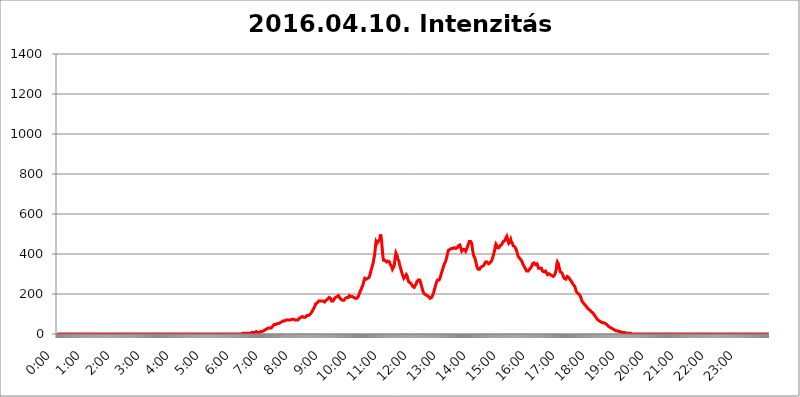
| Category | 2016.04.10. Intenzitás [W/m^2] |
|---|---|
| 0.0 | 0 |
| 0.0006944444444444445 | 0 |
| 0.001388888888888889 | 0 |
| 0.0020833333333333333 | 0 |
| 0.002777777777777778 | 0 |
| 0.003472222222222222 | 0 |
| 0.004166666666666667 | 0 |
| 0.004861111111111111 | 0 |
| 0.005555555555555556 | 0 |
| 0.0062499999999999995 | 0 |
| 0.006944444444444444 | 0 |
| 0.007638888888888889 | 0 |
| 0.008333333333333333 | 0 |
| 0.009027777777777779 | 0 |
| 0.009722222222222222 | 0 |
| 0.010416666666666666 | 0 |
| 0.011111111111111112 | 0 |
| 0.011805555555555555 | 0 |
| 0.012499999999999999 | 0 |
| 0.013194444444444444 | 0 |
| 0.013888888888888888 | 0 |
| 0.014583333333333332 | 0 |
| 0.015277777777777777 | 0 |
| 0.015972222222222224 | 0 |
| 0.016666666666666666 | 0 |
| 0.017361111111111112 | 0 |
| 0.018055555555555557 | 0 |
| 0.01875 | 0 |
| 0.019444444444444445 | 0 |
| 0.02013888888888889 | 0 |
| 0.020833333333333332 | 0 |
| 0.02152777777777778 | 0 |
| 0.022222222222222223 | 0 |
| 0.02291666666666667 | 0 |
| 0.02361111111111111 | 0 |
| 0.024305555555555556 | 0 |
| 0.024999999999999998 | 0 |
| 0.025694444444444447 | 0 |
| 0.02638888888888889 | 0 |
| 0.027083333333333334 | 0 |
| 0.027777777777777776 | 0 |
| 0.02847222222222222 | 0 |
| 0.029166666666666664 | 0 |
| 0.029861111111111113 | 0 |
| 0.030555555555555555 | 0 |
| 0.03125 | 0 |
| 0.03194444444444445 | 0 |
| 0.03263888888888889 | 0 |
| 0.03333333333333333 | 0 |
| 0.034027777777777775 | 0 |
| 0.034722222222222224 | 0 |
| 0.035416666666666666 | 0 |
| 0.036111111111111115 | 0 |
| 0.03680555555555556 | 0 |
| 0.0375 | 0 |
| 0.03819444444444444 | 0 |
| 0.03888888888888889 | 0 |
| 0.03958333333333333 | 0 |
| 0.04027777777777778 | 0 |
| 0.04097222222222222 | 0 |
| 0.041666666666666664 | 0 |
| 0.042361111111111106 | 0 |
| 0.04305555555555556 | 0 |
| 0.043750000000000004 | 0 |
| 0.044444444444444446 | 0 |
| 0.04513888888888889 | 0 |
| 0.04583333333333334 | 0 |
| 0.04652777777777778 | 0 |
| 0.04722222222222222 | 0 |
| 0.04791666666666666 | 0 |
| 0.04861111111111111 | 0 |
| 0.049305555555555554 | 0 |
| 0.049999999999999996 | 0 |
| 0.05069444444444445 | 0 |
| 0.051388888888888894 | 0 |
| 0.052083333333333336 | 0 |
| 0.05277777777777778 | 0 |
| 0.05347222222222222 | 0 |
| 0.05416666666666667 | 0 |
| 0.05486111111111111 | 0 |
| 0.05555555555555555 | 0 |
| 0.05625 | 0 |
| 0.05694444444444444 | 0 |
| 0.057638888888888885 | 0 |
| 0.05833333333333333 | 0 |
| 0.05902777777777778 | 0 |
| 0.059722222222222225 | 0 |
| 0.06041666666666667 | 0 |
| 0.061111111111111116 | 0 |
| 0.06180555555555556 | 0 |
| 0.0625 | 0 |
| 0.06319444444444444 | 0 |
| 0.06388888888888888 | 0 |
| 0.06458333333333334 | 0 |
| 0.06527777777777778 | 0 |
| 0.06597222222222222 | 0 |
| 0.06666666666666667 | 0 |
| 0.06736111111111111 | 0 |
| 0.06805555555555555 | 0 |
| 0.06874999999999999 | 0 |
| 0.06944444444444443 | 0 |
| 0.07013888888888889 | 0 |
| 0.07083333333333333 | 0 |
| 0.07152777777777779 | 0 |
| 0.07222222222222223 | 0 |
| 0.07291666666666667 | 0 |
| 0.07361111111111111 | 0 |
| 0.07430555555555556 | 0 |
| 0.075 | 0 |
| 0.07569444444444444 | 0 |
| 0.0763888888888889 | 0 |
| 0.07708333333333334 | 0 |
| 0.07777777777777778 | 0 |
| 0.07847222222222222 | 0 |
| 0.07916666666666666 | 0 |
| 0.0798611111111111 | 0 |
| 0.08055555555555556 | 0 |
| 0.08125 | 0 |
| 0.08194444444444444 | 0 |
| 0.08263888888888889 | 0 |
| 0.08333333333333333 | 0 |
| 0.08402777777777777 | 0 |
| 0.08472222222222221 | 0 |
| 0.08541666666666665 | 0 |
| 0.08611111111111112 | 0 |
| 0.08680555555555557 | 0 |
| 0.08750000000000001 | 0 |
| 0.08819444444444445 | 0 |
| 0.08888888888888889 | 0 |
| 0.08958333333333333 | 0 |
| 0.09027777777777778 | 0 |
| 0.09097222222222222 | 0 |
| 0.09166666666666667 | 0 |
| 0.09236111111111112 | 0 |
| 0.09305555555555556 | 0 |
| 0.09375 | 0 |
| 0.09444444444444444 | 0 |
| 0.09513888888888888 | 0 |
| 0.09583333333333333 | 0 |
| 0.09652777777777777 | 0 |
| 0.09722222222222222 | 0 |
| 0.09791666666666667 | 0 |
| 0.09861111111111111 | 0 |
| 0.09930555555555555 | 0 |
| 0.09999999999999999 | 0 |
| 0.10069444444444443 | 0 |
| 0.1013888888888889 | 0 |
| 0.10208333333333335 | 0 |
| 0.10277777777777779 | 0 |
| 0.10347222222222223 | 0 |
| 0.10416666666666667 | 0 |
| 0.10486111111111111 | 0 |
| 0.10555555555555556 | 0 |
| 0.10625 | 0 |
| 0.10694444444444444 | 0 |
| 0.1076388888888889 | 0 |
| 0.10833333333333334 | 0 |
| 0.10902777777777778 | 0 |
| 0.10972222222222222 | 0 |
| 0.1111111111111111 | 0 |
| 0.11180555555555556 | 0 |
| 0.11180555555555556 | 0 |
| 0.1125 | 0 |
| 0.11319444444444444 | 0 |
| 0.11388888888888889 | 0 |
| 0.11458333333333333 | 0 |
| 0.11527777777777777 | 0 |
| 0.11597222222222221 | 0 |
| 0.11666666666666665 | 0 |
| 0.1173611111111111 | 0 |
| 0.11805555555555557 | 0 |
| 0.11944444444444445 | 0 |
| 0.12013888888888889 | 0 |
| 0.12083333333333333 | 0 |
| 0.12152777777777778 | 0 |
| 0.12222222222222223 | 0 |
| 0.12291666666666667 | 0 |
| 0.12291666666666667 | 0 |
| 0.12361111111111112 | 0 |
| 0.12430555555555556 | 0 |
| 0.125 | 0 |
| 0.12569444444444444 | 0 |
| 0.12638888888888888 | 0 |
| 0.12708333333333333 | 0 |
| 0.16875 | 0 |
| 0.12847222222222224 | 0 |
| 0.12916666666666668 | 0 |
| 0.12986111111111112 | 0 |
| 0.13055555555555556 | 0 |
| 0.13125 | 0 |
| 0.13194444444444445 | 0 |
| 0.1326388888888889 | 0 |
| 0.13333333333333333 | 0 |
| 0.13402777777777777 | 0 |
| 0.13402777777777777 | 0 |
| 0.13472222222222222 | 0 |
| 0.13541666666666666 | 0 |
| 0.1361111111111111 | 0 |
| 0.13749999999999998 | 0 |
| 0.13819444444444443 | 0 |
| 0.1388888888888889 | 0 |
| 0.13958333333333334 | 0 |
| 0.14027777777777778 | 0 |
| 0.14097222222222222 | 0 |
| 0.14166666666666666 | 0 |
| 0.1423611111111111 | 0 |
| 0.14305555555555557 | 0 |
| 0.14375000000000002 | 0 |
| 0.14444444444444446 | 0 |
| 0.1451388888888889 | 0 |
| 0.1451388888888889 | 0 |
| 0.14652777777777778 | 0 |
| 0.14722222222222223 | 0 |
| 0.14791666666666667 | 0 |
| 0.1486111111111111 | 0 |
| 0.14930555555555555 | 0 |
| 0.15 | 0 |
| 0.15069444444444444 | 0 |
| 0.15138888888888888 | 0 |
| 0.15208333333333332 | 0 |
| 0.15277777777777776 | 0 |
| 0.15347222222222223 | 0 |
| 0.15416666666666667 | 0 |
| 0.15486111111111112 | 0 |
| 0.15555555555555556 | 0 |
| 0.15625 | 0 |
| 0.15694444444444444 | 0 |
| 0.15763888888888888 | 0 |
| 0.15833333333333333 | 0 |
| 0.15902777777777777 | 0 |
| 0.15972222222222224 | 0 |
| 0.16041666666666668 | 0 |
| 0.16111111111111112 | 0 |
| 0.16180555555555556 | 0 |
| 0.1625 | 0 |
| 0.16319444444444445 | 0 |
| 0.1638888888888889 | 0 |
| 0.16458333333333333 | 0 |
| 0.16527777777777777 | 0 |
| 0.16597222222222222 | 0 |
| 0.16666666666666666 | 0 |
| 0.1673611111111111 | 0 |
| 0.16805555555555554 | 0 |
| 0.16874999999999998 | 0 |
| 0.16944444444444443 | 0 |
| 0.17013888888888887 | 0 |
| 0.1708333333333333 | 0 |
| 0.17152777777777775 | 0 |
| 0.17222222222222225 | 0 |
| 0.1729166666666667 | 0 |
| 0.17361111111111113 | 0 |
| 0.17430555555555557 | 0 |
| 0.17500000000000002 | 0 |
| 0.17569444444444446 | 0 |
| 0.1763888888888889 | 0 |
| 0.17708333333333334 | 0 |
| 0.17777777777777778 | 0 |
| 0.17847222222222223 | 0 |
| 0.17916666666666667 | 0 |
| 0.1798611111111111 | 0 |
| 0.18055555555555555 | 0 |
| 0.18125 | 0 |
| 0.18194444444444444 | 0 |
| 0.1826388888888889 | 0 |
| 0.18333333333333335 | 0 |
| 0.1840277777777778 | 0 |
| 0.18472222222222223 | 0 |
| 0.18541666666666667 | 0 |
| 0.18611111111111112 | 0 |
| 0.18680555555555556 | 0 |
| 0.1875 | 0 |
| 0.18819444444444444 | 0 |
| 0.18888888888888888 | 0 |
| 0.18958333333333333 | 0 |
| 0.19027777777777777 | 0 |
| 0.1909722222222222 | 0 |
| 0.19166666666666665 | 0 |
| 0.19236111111111112 | 0 |
| 0.19305555555555554 | 0 |
| 0.19375 | 0 |
| 0.19444444444444445 | 0 |
| 0.1951388888888889 | 0 |
| 0.19583333333333333 | 0 |
| 0.19652777777777777 | 0 |
| 0.19722222222222222 | 0 |
| 0.19791666666666666 | 0 |
| 0.1986111111111111 | 0 |
| 0.19930555555555554 | 0 |
| 0.19999999999999998 | 0 |
| 0.20069444444444443 | 0 |
| 0.20138888888888887 | 0 |
| 0.2020833333333333 | 0 |
| 0.2027777777777778 | 0 |
| 0.2034722222222222 | 0 |
| 0.2041666666666667 | 0 |
| 0.20486111111111113 | 0 |
| 0.20555555555555557 | 0 |
| 0.20625000000000002 | 0 |
| 0.20694444444444446 | 0 |
| 0.2076388888888889 | 0 |
| 0.20833333333333334 | 0 |
| 0.20902777777777778 | 0 |
| 0.20972222222222223 | 0 |
| 0.21041666666666667 | 0 |
| 0.2111111111111111 | 0 |
| 0.21180555555555555 | 0 |
| 0.2125 | 0 |
| 0.21319444444444444 | 0 |
| 0.2138888888888889 | 0 |
| 0.21458333333333335 | 0 |
| 0.2152777777777778 | 0 |
| 0.21597222222222223 | 0 |
| 0.21666666666666667 | 0 |
| 0.21736111111111112 | 0 |
| 0.21805555555555556 | 0 |
| 0.21875 | 0 |
| 0.21944444444444444 | 0 |
| 0.22013888888888888 | 0 |
| 0.22083333333333333 | 0 |
| 0.22152777777777777 | 0 |
| 0.2222222222222222 | 0 |
| 0.22291666666666665 | 0 |
| 0.2236111111111111 | 0 |
| 0.22430555555555556 | 0 |
| 0.225 | 0 |
| 0.22569444444444445 | 0 |
| 0.2263888888888889 | 0 |
| 0.22708333333333333 | 0 |
| 0.22777777777777777 | 0 |
| 0.22847222222222222 | 0 |
| 0.22916666666666666 | 0 |
| 0.2298611111111111 | 0 |
| 0.23055555555555554 | 0 |
| 0.23124999999999998 | 0 |
| 0.23194444444444443 | 0 |
| 0.23263888888888887 | 0 |
| 0.2333333333333333 | 0 |
| 0.2340277777777778 | 0 |
| 0.2347222222222222 | 0 |
| 0.2354166666666667 | 0 |
| 0.23611111111111113 | 0 |
| 0.23680555555555557 | 0 |
| 0.23750000000000002 | 0 |
| 0.23819444444444446 | 0 |
| 0.2388888888888889 | 0 |
| 0.23958333333333334 | 0 |
| 0.24027777777777778 | 0 |
| 0.24097222222222223 | 0 |
| 0.24166666666666667 | 0 |
| 0.2423611111111111 | 0 |
| 0.24305555555555555 | 0 |
| 0.24375 | 0 |
| 0.24444444444444446 | 0 |
| 0.24513888888888888 | 0 |
| 0.24583333333333335 | 0 |
| 0.2465277777777778 | 0 |
| 0.24722222222222223 | 0 |
| 0.24791666666666667 | 0 |
| 0.24861111111111112 | 0 |
| 0.24930555555555556 | 0 |
| 0.25 | 0 |
| 0.25069444444444444 | 0 |
| 0.2513888888888889 | 0 |
| 0.2520833333333333 | 0 |
| 0.25277777777777777 | 0 |
| 0.2534722222222222 | 0 |
| 0.25416666666666665 | 0 |
| 0.2548611111111111 | 0 |
| 0.2555555555555556 | 0 |
| 0.25625000000000003 | 0 |
| 0.2569444444444445 | 0 |
| 0.2576388888888889 | 0 |
| 0.25833333333333336 | 0 |
| 0.2590277777777778 | 0 |
| 0.25972222222222224 | 0 |
| 0.2604166666666667 | 3.525 |
| 0.2611111111111111 | 3.525 |
| 0.26180555555555557 | 3.525 |
| 0.2625 | 3.525 |
| 0.26319444444444445 | 3.525 |
| 0.2638888888888889 | 3.525 |
| 0.26458333333333334 | 3.525 |
| 0.2652777777777778 | 3.525 |
| 0.2659722222222222 | 3.525 |
| 0.26666666666666666 | 3.525 |
| 0.2673611111111111 | 3.525 |
| 0.26805555555555555 | 3.525 |
| 0.26875 | 3.525 |
| 0.26944444444444443 | 3.525 |
| 0.2701388888888889 | 3.525 |
| 0.2708333333333333 | 3.525 |
| 0.27152777777777776 | 3.525 |
| 0.2722222222222222 | 3.525 |
| 0.27291666666666664 | 7.887 |
| 0.2736111111111111 | 7.887 |
| 0.2743055555555555 | 7.887 |
| 0.27499999999999997 | 7.887 |
| 0.27569444444444446 | 7.887 |
| 0.27638888888888885 | 7.887 |
| 0.27708333333333335 | 7.887 |
| 0.2777777777777778 | 7.887 |
| 0.27847222222222223 | 7.887 |
| 0.2791666666666667 | 12.257 |
| 0.2798611111111111 | 12.257 |
| 0.28055555555555556 | 7.887 |
| 0.28125 | 7.887 |
| 0.28194444444444444 | 7.887 |
| 0.2826388888888889 | 7.887 |
| 0.2833333333333333 | 7.887 |
| 0.28402777777777777 | 7.887 |
| 0.2847222222222222 | 7.887 |
| 0.28541666666666665 | 12.257 |
| 0.28611111111111115 | 12.257 |
| 0.28680555555555554 | 12.257 |
| 0.28750000000000003 | 12.257 |
| 0.2881944444444445 | 12.257 |
| 0.2888888888888889 | 16.636 |
| 0.28958333333333336 | 16.636 |
| 0.2902777777777778 | 16.636 |
| 0.29097222222222224 | 16.636 |
| 0.2916666666666667 | 21.024 |
| 0.2923611111111111 | 21.024 |
| 0.29305555555555557 | 21.024 |
| 0.29375 | 25.419 |
| 0.29444444444444445 | 25.419 |
| 0.2951388888888889 | 25.419 |
| 0.29583333333333334 | 29.823 |
| 0.2965277777777778 | 29.823 |
| 0.2972222222222222 | 29.823 |
| 0.29791666666666666 | 29.823 |
| 0.2986111111111111 | 29.823 |
| 0.29930555555555555 | 29.823 |
| 0.3 | 29.823 |
| 0.30069444444444443 | 34.234 |
| 0.3013888888888889 | 34.234 |
| 0.3020833333333333 | 38.653 |
| 0.30277777777777776 | 43.079 |
| 0.3034722222222222 | 43.079 |
| 0.30416666666666664 | 47.511 |
| 0.3048611111111111 | 47.511 |
| 0.3055555555555555 | 47.511 |
| 0.30624999999999997 | 47.511 |
| 0.3069444444444444 | 51.951 |
| 0.3076388888888889 | 51.951 |
| 0.30833333333333335 | 51.951 |
| 0.3090277777777778 | 51.951 |
| 0.30972222222222223 | 51.951 |
| 0.3104166666666667 | 51.951 |
| 0.3111111111111111 | 51.951 |
| 0.31180555555555556 | 51.951 |
| 0.3125 | 56.398 |
| 0.31319444444444444 | 56.398 |
| 0.3138888888888889 | 60.85 |
| 0.3145833333333333 | 60.85 |
| 0.31527777777777777 | 65.31 |
| 0.3159722222222222 | 65.31 |
| 0.31666666666666665 | 65.31 |
| 0.31736111111111115 | 65.31 |
| 0.31805555555555554 | 65.31 |
| 0.31875000000000003 | 65.31 |
| 0.3194444444444445 | 65.31 |
| 0.3201388888888889 | 65.31 |
| 0.32083333333333336 | 69.775 |
| 0.3215277777777778 | 69.775 |
| 0.32222222222222224 | 69.775 |
| 0.3229166666666667 | 69.775 |
| 0.3236111111111111 | 69.775 |
| 0.32430555555555557 | 69.775 |
| 0.325 | 69.775 |
| 0.32569444444444445 | 69.775 |
| 0.3263888888888889 | 69.775 |
| 0.32708333333333334 | 69.775 |
| 0.3277777777777778 | 69.775 |
| 0.3284722222222222 | 74.246 |
| 0.32916666666666666 | 74.246 |
| 0.3298611111111111 | 74.246 |
| 0.33055555555555555 | 74.246 |
| 0.33125 | 74.246 |
| 0.33194444444444443 | 74.246 |
| 0.3326388888888889 | 74.246 |
| 0.3333333333333333 | 69.775 |
| 0.3340277777777778 | 69.775 |
| 0.3347222222222222 | 69.775 |
| 0.3354166666666667 | 69.775 |
| 0.3361111111111111 | 69.775 |
| 0.3368055555555556 | 69.775 |
| 0.33749999999999997 | 69.775 |
| 0.33819444444444446 | 74.246 |
| 0.33888888888888885 | 74.246 |
| 0.33958333333333335 | 78.722 |
| 0.34027777777777773 | 78.722 |
| 0.34097222222222223 | 83.205 |
| 0.3416666666666666 | 83.205 |
| 0.3423611111111111 | 83.205 |
| 0.3430555555555555 | 83.205 |
| 0.34375 | 87.692 |
| 0.3444444444444445 | 87.692 |
| 0.3451388888888889 | 83.205 |
| 0.3458333333333334 | 83.205 |
| 0.34652777777777777 | 83.205 |
| 0.34722222222222227 | 83.205 |
| 0.34791666666666665 | 83.205 |
| 0.34861111111111115 | 83.205 |
| 0.34930555555555554 | 87.692 |
| 0.35000000000000003 | 92.184 |
| 0.3506944444444444 | 92.184 |
| 0.3513888888888889 | 96.682 |
| 0.3520833333333333 | 92.184 |
| 0.3527777777777778 | 92.184 |
| 0.3534722222222222 | 92.184 |
| 0.3541666666666667 | 96.682 |
| 0.3548611111111111 | 101.184 |
| 0.35555555555555557 | 101.184 |
| 0.35625 | 105.69 |
| 0.35694444444444445 | 110.201 |
| 0.3576388888888889 | 110.201 |
| 0.35833333333333334 | 119.235 |
| 0.3590277777777778 | 123.758 |
| 0.3597222222222222 | 128.284 |
| 0.36041666666666666 | 132.814 |
| 0.3611111111111111 | 137.347 |
| 0.36180555555555555 | 141.884 |
| 0.3625 | 150.964 |
| 0.36319444444444443 | 155.509 |
| 0.3638888888888889 | 155.509 |
| 0.3645833333333333 | 155.509 |
| 0.3652777777777778 | 160.056 |
| 0.3659722222222222 | 160.056 |
| 0.3666666666666667 | 164.605 |
| 0.3673611111111111 | 164.605 |
| 0.3680555555555556 | 164.605 |
| 0.36874999999999997 | 164.605 |
| 0.36944444444444446 | 164.605 |
| 0.37013888888888885 | 164.605 |
| 0.37083333333333335 | 164.605 |
| 0.37152777777777773 | 164.605 |
| 0.37222222222222223 | 164.605 |
| 0.3729166666666666 | 164.605 |
| 0.3736111111111111 | 164.605 |
| 0.3743055555555555 | 164.605 |
| 0.375 | 160.056 |
| 0.3756944444444445 | 164.605 |
| 0.3763888888888889 | 164.605 |
| 0.3770833333333334 | 169.156 |
| 0.37777777777777777 | 169.156 |
| 0.37847222222222227 | 173.709 |
| 0.37916666666666665 | 173.709 |
| 0.37986111111111115 | 173.709 |
| 0.38055555555555554 | 178.264 |
| 0.38125000000000003 | 182.82 |
| 0.3819444444444444 | 182.82 |
| 0.3826388888888889 | 182.82 |
| 0.3833333333333333 | 178.264 |
| 0.3840277777777778 | 173.709 |
| 0.3847222222222222 | 164.605 |
| 0.3854166666666667 | 164.605 |
| 0.3861111111111111 | 164.605 |
| 0.38680555555555557 | 164.605 |
| 0.3875 | 169.156 |
| 0.38819444444444445 | 173.709 |
| 0.3888888888888889 | 173.709 |
| 0.38958333333333334 | 178.264 |
| 0.3902777777777778 | 182.82 |
| 0.3909722222222222 | 182.82 |
| 0.39166666666666666 | 187.378 |
| 0.3923611111111111 | 187.378 |
| 0.39305555555555555 | 191.937 |
| 0.39375 | 191.937 |
| 0.39444444444444443 | 191.937 |
| 0.3951388888888889 | 187.378 |
| 0.3958333333333333 | 182.82 |
| 0.3965277777777778 | 182.82 |
| 0.3972222222222222 | 178.264 |
| 0.3979166666666667 | 173.709 |
| 0.3986111111111111 | 173.709 |
| 0.3993055555555556 | 169.156 |
| 0.39999999999999997 | 169.156 |
| 0.40069444444444446 | 169.156 |
| 0.40138888888888885 | 169.156 |
| 0.40208333333333335 | 169.156 |
| 0.40277777777777773 | 169.156 |
| 0.40347222222222223 | 173.709 |
| 0.4041666666666666 | 178.264 |
| 0.4048611111111111 | 182.82 |
| 0.4055555555555555 | 182.82 |
| 0.40625 | 182.82 |
| 0.4069444444444445 | 182.82 |
| 0.4076388888888889 | 182.82 |
| 0.4083333333333334 | 182.82 |
| 0.40902777777777777 | 182.82 |
| 0.40972222222222227 | 191.937 |
| 0.41041666666666665 | 196.497 |
| 0.41111111111111115 | 191.937 |
| 0.41180555555555554 | 187.378 |
| 0.41250000000000003 | 187.378 |
| 0.4131944444444444 | 187.378 |
| 0.4138888888888889 | 187.378 |
| 0.4145833333333333 | 187.378 |
| 0.4152777777777778 | 182.82 |
| 0.4159722222222222 | 182.82 |
| 0.4166666666666667 | 182.82 |
| 0.4173611111111111 | 178.264 |
| 0.41805555555555557 | 178.264 |
| 0.41875 | 178.264 |
| 0.41944444444444445 | 178.264 |
| 0.4201388888888889 | 178.264 |
| 0.42083333333333334 | 178.264 |
| 0.4215277777777778 | 182.82 |
| 0.4222222222222222 | 187.378 |
| 0.42291666666666666 | 191.937 |
| 0.4236111111111111 | 201.058 |
| 0.42430555555555555 | 205.62 |
| 0.425 | 214.746 |
| 0.42569444444444443 | 219.309 |
| 0.4263888888888889 | 223.873 |
| 0.4270833333333333 | 233 |
| 0.4277777777777778 | 237.564 |
| 0.4284722222222222 | 242.127 |
| 0.4291666666666667 | 251.251 |
| 0.4298611111111111 | 260.373 |
| 0.4305555555555556 | 269.49 |
| 0.43124999999999997 | 278.603 |
| 0.43194444444444446 | 278.603 |
| 0.43263888888888885 | 274.047 |
| 0.43333333333333335 | 274.047 |
| 0.43402777777777773 | 278.603 |
| 0.43472222222222223 | 278.603 |
| 0.4354166666666666 | 278.603 |
| 0.4361111111111111 | 278.603 |
| 0.4368055555555555 | 278.603 |
| 0.4375 | 283.156 |
| 0.4381944444444445 | 292.259 |
| 0.4388888888888889 | 301.354 |
| 0.4395833333333334 | 310.44 |
| 0.44027777777777777 | 319.517 |
| 0.44097222222222227 | 328.584 |
| 0.44166666666666665 | 337.639 |
| 0.44236111111111115 | 346.682 |
| 0.44305555555555554 | 355.712 |
| 0.44375000000000003 | 369.23 |
| 0.4444444444444444 | 382.715 |
| 0.4451388888888889 | 396.164 |
| 0.4458333333333333 | 418.492 |
| 0.4465277777777778 | 445.129 |
| 0.4472222222222222 | 462.786 |
| 0.4479166666666667 | 458.38 |
| 0.4486111111111111 | 453.968 |
| 0.44930555555555557 | 458.38 |
| 0.45 | 462.786 |
| 0.45069444444444445 | 458.38 |
| 0.4513888888888889 | 458.38 |
| 0.45208333333333334 | 471.582 |
| 0.4527777777777778 | 484.735 |
| 0.4534722222222222 | 497.836 |
| 0.45416666666666666 | 484.735 |
| 0.4548611111111111 | 467.187 |
| 0.45555555555555555 | 436.27 |
| 0.45625 | 405.108 |
| 0.45694444444444443 | 382.715 |
| 0.4576388888888889 | 369.23 |
| 0.4583333333333333 | 364.728 |
| 0.4590277777777778 | 369.23 |
| 0.4597222222222222 | 369.23 |
| 0.4604166666666667 | 364.728 |
| 0.4611111111111111 | 364.728 |
| 0.4618055555555556 | 360.221 |
| 0.46249999999999997 | 360.221 |
| 0.46319444444444446 | 360.221 |
| 0.46388888888888885 | 364.728 |
| 0.46458333333333335 | 369.23 |
| 0.46527777777777773 | 369.23 |
| 0.46597222222222223 | 360.221 |
| 0.4666666666666666 | 351.198 |
| 0.4673611111111111 | 346.682 |
| 0.4680555555555555 | 342.162 |
| 0.46875 | 342.162 |
| 0.4694444444444445 | 333.113 |
| 0.4701388888888889 | 324.052 |
| 0.4708333333333334 | 324.052 |
| 0.47152777777777777 | 324.052 |
| 0.47222222222222227 | 337.639 |
| 0.47291666666666665 | 351.198 |
| 0.47361111111111115 | 373.729 |
| 0.47430555555555554 | 391.685 |
| 0.47500000000000003 | 405.108 |
| 0.4756944444444444 | 405.108 |
| 0.4763888888888889 | 405.108 |
| 0.4770833333333333 | 387.202 |
| 0.4777777777777778 | 373.729 |
| 0.4784722222222222 | 369.23 |
| 0.4791666666666667 | 364.728 |
| 0.4798611111111111 | 351.198 |
| 0.48055555555555557 | 342.162 |
| 0.48125 | 337.639 |
| 0.48194444444444445 | 324.052 |
| 0.4826388888888889 | 314.98 |
| 0.48333333333333334 | 305.898 |
| 0.4840277777777778 | 301.354 |
| 0.4847222222222222 | 292.259 |
| 0.48541666666666666 | 287.709 |
| 0.4861111111111111 | 278.603 |
| 0.48680555555555555 | 278.603 |
| 0.4875 | 283.156 |
| 0.48819444444444443 | 287.709 |
| 0.4888888888888889 | 287.709 |
| 0.4895833333333333 | 296.808 |
| 0.4902777777777778 | 296.808 |
| 0.4909722222222222 | 287.709 |
| 0.4916666666666667 | 274.047 |
| 0.4923611111111111 | 269.49 |
| 0.4930555555555556 | 260.373 |
| 0.49374999999999997 | 260.373 |
| 0.49444444444444446 | 255.813 |
| 0.49513888888888885 | 255.813 |
| 0.49583333333333335 | 251.251 |
| 0.49652777777777773 | 251.251 |
| 0.49722222222222223 | 246.689 |
| 0.4979166666666666 | 242.127 |
| 0.4986111111111111 | 237.564 |
| 0.4993055555555555 | 233 |
| 0.5 | 233 |
| 0.5006944444444444 | 233 |
| 0.5013888888888889 | 233 |
| 0.5020833333333333 | 242.127 |
| 0.5027777777777778 | 246.689 |
| 0.5034722222222222 | 251.251 |
| 0.5041666666666667 | 260.373 |
| 0.5048611111111111 | 260.373 |
| 0.5055555555555555 | 264.932 |
| 0.50625 | 269.49 |
| 0.5069444444444444 | 269.49 |
| 0.5076388888888889 | 269.49 |
| 0.5083333333333333 | 269.49 |
| 0.5090277777777777 | 264.932 |
| 0.5097222222222222 | 255.813 |
| 0.5104166666666666 | 246.689 |
| 0.5111111111111112 | 237.564 |
| 0.5118055555555555 | 228.436 |
| 0.5125000000000001 | 219.309 |
| 0.5131944444444444 | 210.182 |
| 0.513888888888889 | 205.62 |
| 0.5145833333333333 | 201.058 |
| 0.5152777777777778 | 201.058 |
| 0.5159722222222222 | 196.497 |
| 0.5166666666666667 | 196.497 |
| 0.517361111111111 | 196.497 |
| 0.5180555555555556 | 196.497 |
| 0.5187499999999999 | 191.937 |
| 0.5194444444444445 | 191.937 |
| 0.5201388888888888 | 187.378 |
| 0.5208333333333334 | 187.378 |
| 0.5215277777777778 | 182.82 |
| 0.5222222222222223 | 182.82 |
| 0.5229166666666667 | 178.264 |
| 0.5236111111111111 | 178.264 |
| 0.5243055555555556 | 182.82 |
| 0.525 | 182.82 |
| 0.5256944444444445 | 187.378 |
| 0.5263888888888889 | 191.937 |
| 0.5270833333333333 | 196.497 |
| 0.5277777777777778 | 205.62 |
| 0.5284722222222222 | 214.746 |
| 0.5291666666666667 | 223.873 |
| 0.5298611111111111 | 233 |
| 0.5305555555555556 | 242.127 |
| 0.53125 | 251.251 |
| 0.5319444444444444 | 260.373 |
| 0.5326388888888889 | 264.932 |
| 0.5333333333333333 | 269.49 |
| 0.5340277777777778 | 269.49 |
| 0.5347222222222222 | 269.49 |
| 0.5354166666666667 | 269.49 |
| 0.5361111111111111 | 274.047 |
| 0.5368055555555555 | 278.603 |
| 0.5375 | 287.709 |
| 0.5381944444444444 | 296.808 |
| 0.5388888888888889 | 305.898 |
| 0.5395833333333333 | 310.44 |
| 0.5402777777777777 | 319.517 |
| 0.5409722222222222 | 328.584 |
| 0.5416666666666666 | 337.639 |
| 0.5423611111111112 | 342.162 |
| 0.5430555555555555 | 351.198 |
| 0.5437500000000001 | 355.712 |
| 0.5444444444444444 | 360.221 |
| 0.545138888888889 | 369.23 |
| 0.5458333333333333 | 378.224 |
| 0.5465277777777778 | 387.202 |
| 0.5472222222222222 | 400.638 |
| 0.5479166666666667 | 409.574 |
| 0.548611111111111 | 418.492 |
| 0.5493055555555556 | 422.943 |
| 0.5499999999999999 | 422.943 |
| 0.5506944444444445 | 422.943 |
| 0.5513888888888888 | 427.39 |
| 0.5520833333333334 | 427.39 |
| 0.5527777777777778 | 427.39 |
| 0.5534722222222223 | 427.39 |
| 0.5541666666666667 | 427.39 |
| 0.5548611111111111 | 427.39 |
| 0.5555555555555556 | 427.39 |
| 0.55625 | 431.833 |
| 0.5569444444444445 | 431.833 |
| 0.5576388888888889 | 431.833 |
| 0.5583333333333333 | 431.833 |
| 0.5590277777777778 | 427.39 |
| 0.5597222222222222 | 431.833 |
| 0.5604166666666667 | 431.833 |
| 0.5611111111111111 | 431.833 |
| 0.5618055555555556 | 436.27 |
| 0.5625 | 440.702 |
| 0.5631944444444444 | 440.702 |
| 0.5638888888888889 | 445.129 |
| 0.5645833333333333 | 445.129 |
| 0.5652777777777778 | 440.702 |
| 0.5659722222222222 | 431.833 |
| 0.5666666666666667 | 422.943 |
| 0.5673611111111111 | 414.035 |
| 0.5680555555555555 | 414.035 |
| 0.56875 | 418.492 |
| 0.5694444444444444 | 422.943 |
| 0.5701388888888889 | 422.943 |
| 0.5708333333333333 | 427.39 |
| 0.5715277777777777 | 422.943 |
| 0.5722222222222222 | 418.492 |
| 0.5729166666666666 | 414.035 |
| 0.5736111111111112 | 414.035 |
| 0.5743055555555555 | 418.492 |
| 0.5750000000000001 | 431.833 |
| 0.5756944444444444 | 440.702 |
| 0.576388888888889 | 445.129 |
| 0.5770833333333333 | 453.968 |
| 0.5777777777777778 | 462.786 |
| 0.5784722222222222 | 467.187 |
| 0.5791666666666667 | 462.786 |
| 0.579861111111111 | 462.786 |
| 0.5805555555555556 | 462.786 |
| 0.5812499999999999 | 453.968 |
| 0.5819444444444445 | 436.27 |
| 0.5826388888888888 | 418.492 |
| 0.5833333333333334 | 405.108 |
| 0.5840277777777778 | 391.685 |
| 0.5847222222222223 | 387.202 |
| 0.5854166666666667 | 382.715 |
| 0.5861111111111111 | 378.224 |
| 0.5868055555555556 | 364.728 |
| 0.5875 | 355.712 |
| 0.5881944444444445 | 342.162 |
| 0.5888888888888889 | 333.113 |
| 0.5895833333333333 | 328.584 |
| 0.5902777777777778 | 324.052 |
| 0.5909722222222222 | 324.052 |
| 0.5916666666666667 | 324.052 |
| 0.5923611111111111 | 324.052 |
| 0.5930555555555556 | 324.052 |
| 0.59375 | 333.113 |
| 0.5944444444444444 | 333.113 |
| 0.5951388888888889 | 333.113 |
| 0.5958333333333333 | 337.639 |
| 0.5965277777777778 | 337.639 |
| 0.5972222222222222 | 342.162 |
| 0.5979166666666667 | 342.162 |
| 0.5986111111111111 | 346.682 |
| 0.5993055555555555 | 351.198 |
| 0.6 | 355.712 |
| 0.6006944444444444 | 360.221 |
| 0.6013888888888889 | 355.712 |
| 0.6020833333333333 | 360.221 |
| 0.6027777777777777 | 360.221 |
| 0.6034722222222222 | 360.221 |
| 0.6041666666666666 | 355.712 |
| 0.6048611111111112 | 351.198 |
| 0.6055555555555555 | 351.198 |
| 0.6062500000000001 | 351.198 |
| 0.6069444444444444 | 355.712 |
| 0.607638888888889 | 355.712 |
| 0.6083333333333333 | 355.712 |
| 0.6090277777777778 | 364.728 |
| 0.6097222222222222 | 369.23 |
| 0.6104166666666667 | 378.224 |
| 0.611111111111111 | 387.202 |
| 0.6118055555555556 | 396.164 |
| 0.6124999999999999 | 405.108 |
| 0.6131944444444445 | 414.035 |
| 0.6138888888888888 | 427.39 |
| 0.6145833333333334 | 440.702 |
| 0.6152777777777778 | 449.551 |
| 0.6159722222222223 | 445.129 |
| 0.6166666666666667 | 440.702 |
| 0.6173611111111111 | 431.833 |
| 0.6180555555555556 | 431.833 |
| 0.61875 | 431.833 |
| 0.6194444444444445 | 431.833 |
| 0.6201388888888889 | 436.27 |
| 0.6208333333333333 | 440.702 |
| 0.6215277777777778 | 440.702 |
| 0.6222222222222222 | 445.129 |
| 0.6229166666666667 | 445.129 |
| 0.6236111111111111 | 449.551 |
| 0.6243055555555556 | 453.968 |
| 0.625 | 458.38 |
| 0.6256944444444444 | 462.786 |
| 0.6263888888888889 | 462.786 |
| 0.6270833333333333 | 462.786 |
| 0.6277777777777778 | 467.187 |
| 0.6284722222222222 | 471.582 |
| 0.6291666666666667 | 480.356 |
| 0.6298611111111111 | 484.735 |
| 0.6305555555555555 | 489.108 |
| 0.63125 | 480.356 |
| 0.6319444444444444 | 471.582 |
| 0.6326388888888889 | 462.786 |
| 0.6333333333333333 | 453.968 |
| 0.6340277777777777 | 453.968 |
| 0.6347222222222222 | 458.38 |
| 0.6354166666666666 | 462.786 |
| 0.6361111111111112 | 471.582 |
| 0.6368055555555555 | 462.786 |
| 0.6375000000000001 | 458.38 |
| 0.6381944444444444 | 453.968 |
| 0.638888888888889 | 449.551 |
| 0.6395833333333333 | 440.702 |
| 0.6402777777777778 | 436.27 |
| 0.6409722222222222 | 436.27 |
| 0.6416666666666667 | 436.27 |
| 0.642361111111111 | 431.833 |
| 0.6430555555555556 | 431.833 |
| 0.6437499999999999 | 422.943 |
| 0.6444444444444445 | 414.035 |
| 0.6451388888888888 | 405.108 |
| 0.6458333333333334 | 396.164 |
| 0.6465277777777778 | 387.202 |
| 0.6472222222222223 | 382.715 |
| 0.6479166666666667 | 382.715 |
| 0.6486111111111111 | 378.224 |
| 0.6493055555555556 | 378.224 |
| 0.65 | 378.224 |
| 0.6506944444444445 | 369.23 |
| 0.6513888888888889 | 364.728 |
| 0.6520833333333333 | 360.221 |
| 0.6527777777777778 | 351.198 |
| 0.6534722222222222 | 346.682 |
| 0.6541666666666667 | 342.162 |
| 0.6548611111111111 | 337.639 |
| 0.6555555555555556 | 333.113 |
| 0.65625 | 328.584 |
| 0.6569444444444444 | 324.052 |
| 0.6576388888888889 | 319.517 |
| 0.6583333333333333 | 314.98 |
| 0.6590277777777778 | 314.98 |
| 0.6597222222222222 | 314.98 |
| 0.6604166666666667 | 314.98 |
| 0.6611111111111111 | 319.517 |
| 0.6618055555555555 | 319.517 |
| 0.6625 | 324.052 |
| 0.6631944444444444 | 324.052 |
| 0.6638888888888889 | 328.584 |
| 0.6645833333333333 | 333.113 |
| 0.6652777777777777 | 337.639 |
| 0.6659722222222222 | 342.162 |
| 0.6666666666666666 | 351.198 |
| 0.6673611111111111 | 355.712 |
| 0.6680555555555556 | 355.712 |
| 0.6687500000000001 | 355.712 |
| 0.6694444444444444 | 351.198 |
| 0.6701388888888888 | 351.198 |
| 0.6708333333333334 | 346.682 |
| 0.6715277777777778 | 351.198 |
| 0.6722222222222222 | 351.198 |
| 0.6729166666666666 | 351.198 |
| 0.6736111111111112 | 346.682 |
| 0.6743055555555556 | 337.639 |
| 0.6749999999999999 | 328.584 |
| 0.6756944444444444 | 324.052 |
| 0.6763888888888889 | 324.052 |
| 0.6770833333333334 | 328.584 |
| 0.6777777777777777 | 333.113 |
| 0.6784722222222223 | 333.113 |
| 0.6791666666666667 | 328.584 |
| 0.6798611111111111 | 324.052 |
| 0.6805555555555555 | 314.98 |
| 0.68125 | 314.98 |
| 0.6819444444444445 | 310.44 |
| 0.6826388888888889 | 310.44 |
| 0.6833333333333332 | 314.98 |
| 0.6840277777777778 | 314.98 |
| 0.6847222222222222 | 314.98 |
| 0.6854166666666667 | 310.44 |
| 0.686111111111111 | 305.898 |
| 0.6868055555555556 | 301.354 |
| 0.6875 | 296.808 |
| 0.6881944444444444 | 296.808 |
| 0.688888888888889 | 296.808 |
| 0.6895833333333333 | 301.354 |
| 0.6902777777777778 | 301.354 |
| 0.6909722222222222 | 301.354 |
| 0.6916666666666668 | 296.808 |
| 0.6923611111111111 | 296.808 |
| 0.6930555555555555 | 292.259 |
| 0.69375 | 292.259 |
| 0.6944444444444445 | 287.709 |
| 0.6951388888888889 | 287.709 |
| 0.6958333333333333 | 287.709 |
| 0.6965277777777777 | 287.709 |
| 0.6972222222222223 | 292.259 |
| 0.6979166666666666 | 296.808 |
| 0.6986111111111111 | 305.898 |
| 0.6993055555555556 | 314.98 |
| 0.7000000000000001 | 324.052 |
| 0.7006944444444444 | 351.198 |
| 0.7013888888888888 | 360.221 |
| 0.7020833333333334 | 360.221 |
| 0.7027777777777778 | 351.198 |
| 0.7034722222222222 | 346.682 |
| 0.7041666666666666 | 346.682 |
| 0.7048611111111112 | 319.517 |
| 0.7055555555555556 | 310.44 |
| 0.7062499999999999 | 305.898 |
| 0.7069444444444444 | 305.898 |
| 0.7076388888888889 | 305.898 |
| 0.7083333333333334 | 301.354 |
| 0.7090277777777777 | 296.808 |
| 0.7097222222222223 | 287.709 |
| 0.7104166666666667 | 283.156 |
| 0.7111111111111111 | 278.603 |
| 0.7118055555555555 | 274.047 |
| 0.7125 | 274.047 |
| 0.7131944444444445 | 274.047 |
| 0.7138888888888889 | 274.047 |
| 0.7145833333333332 | 278.603 |
| 0.7152777777777778 | 287.709 |
| 0.7159722222222222 | 287.709 |
| 0.7166666666666667 | 283.156 |
| 0.717361111111111 | 283.156 |
| 0.7180555555555556 | 278.603 |
| 0.71875 | 274.047 |
| 0.7194444444444444 | 269.49 |
| 0.720138888888889 | 269.49 |
| 0.7208333333333333 | 264.932 |
| 0.7215277777777778 | 260.373 |
| 0.7222222222222222 | 260.373 |
| 0.7229166666666668 | 251.251 |
| 0.7236111111111111 | 251.251 |
| 0.7243055555555555 | 246.689 |
| 0.725 | 242.127 |
| 0.7256944444444445 | 237.564 |
| 0.7263888888888889 | 233 |
| 0.7270833333333333 | 223.873 |
| 0.7277777777777777 | 214.746 |
| 0.7284722222222223 | 210.182 |
| 0.7291666666666666 | 205.62 |
| 0.7298611111111111 | 201.058 |
| 0.7305555555555556 | 201.058 |
| 0.7312500000000001 | 201.058 |
| 0.7319444444444444 | 201.058 |
| 0.7326388888888888 | 196.497 |
| 0.7333333333333334 | 191.937 |
| 0.7340277777777778 | 187.378 |
| 0.7347222222222222 | 178.264 |
| 0.7354166666666666 | 169.156 |
| 0.7361111111111112 | 164.605 |
| 0.7368055555555556 | 160.056 |
| 0.7374999999999999 | 155.509 |
| 0.7381944444444444 | 155.509 |
| 0.7388888888888889 | 150.964 |
| 0.7395833333333334 | 150.964 |
| 0.7402777777777777 | 146.423 |
| 0.7409722222222223 | 141.884 |
| 0.7416666666666667 | 137.347 |
| 0.7423611111111111 | 137.347 |
| 0.7430555555555555 | 132.814 |
| 0.74375 | 128.284 |
| 0.7444444444444445 | 128.284 |
| 0.7451388888888889 | 123.758 |
| 0.7458333333333332 | 119.235 |
| 0.7465277777777778 | 119.235 |
| 0.7472222222222222 | 119.235 |
| 0.7479166666666667 | 114.716 |
| 0.748611111111111 | 114.716 |
| 0.7493055555555556 | 110.201 |
| 0.75 | 110.201 |
| 0.7506944444444444 | 105.69 |
| 0.751388888888889 | 105.69 |
| 0.7520833333333333 | 101.184 |
| 0.7527777777777778 | 96.682 |
| 0.7534722222222222 | 96.682 |
| 0.7541666666666668 | 92.184 |
| 0.7548611111111111 | 87.692 |
| 0.7555555555555555 | 83.205 |
| 0.75625 | 78.722 |
| 0.7569444444444445 | 74.246 |
| 0.7576388888888889 | 74.246 |
| 0.7583333333333333 | 69.775 |
| 0.7590277777777777 | 69.775 |
| 0.7597222222222223 | 65.31 |
| 0.7604166666666666 | 65.31 |
| 0.7611111111111111 | 65.31 |
| 0.7618055555555556 | 60.85 |
| 0.7625000000000001 | 60.85 |
| 0.7631944444444444 | 56.398 |
| 0.7638888888888888 | 56.398 |
| 0.7645833333333334 | 56.398 |
| 0.7652777777777778 | 56.398 |
| 0.7659722222222222 | 56.398 |
| 0.7666666666666666 | 56.398 |
| 0.7673611111111112 | 51.951 |
| 0.7680555555555556 | 51.951 |
| 0.7687499999999999 | 51.951 |
| 0.7694444444444444 | 47.511 |
| 0.7701388888888889 | 47.511 |
| 0.7708333333333334 | 47.511 |
| 0.7715277777777777 | 43.079 |
| 0.7722222222222223 | 43.079 |
| 0.7729166666666667 | 38.653 |
| 0.7736111111111111 | 38.653 |
| 0.7743055555555555 | 38.653 |
| 0.775 | 34.234 |
| 0.7756944444444445 | 34.234 |
| 0.7763888888888889 | 34.234 |
| 0.7770833333333332 | 29.823 |
| 0.7777777777777778 | 29.823 |
| 0.7784722222222222 | 29.823 |
| 0.7791666666666667 | 25.419 |
| 0.779861111111111 | 25.419 |
| 0.7805555555555556 | 25.419 |
| 0.78125 | 21.024 |
| 0.7819444444444444 | 21.024 |
| 0.782638888888889 | 21.024 |
| 0.7833333333333333 | 16.636 |
| 0.7840277777777778 | 16.636 |
| 0.7847222222222222 | 16.636 |
| 0.7854166666666668 | 16.636 |
| 0.7861111111111111 | 16.636 |
| 0.7868055555555555 | 12.257 |
| 0.7875 | 12.257 |
| 0.7881944444444445 | 12.257 |
| 0.7888888888888889 | 12.257 |
| 0.7895833333333333 | 12.257 |
| 0.7902777777777777 | 12.257 |
| 0.7909722222222223 | 7.887 |
| 0.7916666666666666 | 7.887 |
| 0.7923611111111111 | 7.887 |
| 0.7930555555555556 | 7.887 |
| 0.7937500000000001 | 7.887 |
| 0.7944444444444444 | 7.887 |
| 0.7951388888888888 | 7.887 |
| 0.7958333333333334 | 7.887 |
| 0.7965277777777778 | 7.887 |
| 0.7972222222222222 | 3.525 |
| 0.7979166666666666 | 3.525 |
| 0.7986111111111112 | 3.525 |
| 0.7993055555555556 | 3.525 |
| 0.7999999999999999 | 3.525 |
| 0.8006944444444444 | 3.525 |
| 0.8013888888888889 | 3.525 |
| 0.8020833333333334 | 3.525 |
| 0.8027777777777777 | 3.525 |
| 0.8034722222222223 | 3.525 |
| 0.8041666666666667 | 3.525 |
| 0.8048611111111111 | 0 |
| 0.8055555555555555 | 0 |
| 0.80625 | 0 |
| 0.8069444444444445 | 0 |
| 0.8076388888888889 | 0 |
| 0.8083333333333332 | 0 |
| 0.8090277777777778 | 0 |
| 0.8097222222222222 | 0 |
| 0.8104166666666667 | 0 |
| 0.811111111111111 | 0 |
| 0.8118055555555556 | 0 |
| 0.8125 | 0 |
| 0.8131944444444444 | 0 |
| 0.813888888888889 | 0 |
| 0.8145833333333333 | 0 |
| 0.8152777777777778 | 0 |
| 0.8159722222222222 | 0 |
| 0.8166666666666668 | 0 |
| 0.8173611111111111 | 0 |
| 0.8180555555555555 | 0 |
| 0.81875 | 0 |
| 0.8194444444444445 | 0 |
| 0.8201388888888889 | 0 |
| 0.8208333333333333 | 0 |
| 0.8215277777777777 | 0 |
| 0.8222222222222223 | 0 |
| 0.8229166666666666 | 0 |
| 0.8236111111111111 | 0 |
| 0.8243055555555556 | 0 |
| 0.8250000000000001 | 0 |
| 0.8256944444444444 | 0 |
| 0.8263888888888888 | 0 |
| 0.8270833333333334 | 0 |
| 0.8277777777777778 | 0 |
| 0.8284722222222222 | 0 |
| 0.8291666666666666 | 0 |
| 0.8298611111111112 | 0 |
| 0.8305555555555556 | 0 |
| 0.8312499999999999 | 0 |
| 0.8319444444444444 | 0 |
| 0.8326388888888889 | 0 |
| 0.8333333333333334 | 0 |
| 0.8340277777777777 | 0 |
| 0.8347222222222223 | 0 |
| 0.8354166666666667 | 0 |
| 0.8361111111111111 | 0 |
| 0.8368055555555555 | 0 |
| 0.8375 | 0 |
| 0.8381944444444445 | 0 |
| 0.8388888888888889 | 0 |
| 0.8395833333333332 | 0 |
| 0.8402777777777778 | 0 |
| 0.8409722222222222 | 0 |
| 0.8416666666666667 | 0 |
| 0.842361111111111 | 0 |
| 0.8430555555555556 | 0 |
| 0.84375 | 0 |
| 0.8444444444444444 | 0 |
| 0.845138888888889 | 0 |
| 0.8458333333333333 | 0 |
| 0.8465277777777778 | 0 |
| 0.8472222222222222 | 0 |
| 0.8479166666666668 | 0 |
| 0.8486111111111111 | 0 |
| 0.8493055555555555 | 0 |
| 0.85 | 0 |
| 0.8506944444444445 | 0 |
| 0.8513888888888889 | 0 |
| 0.8520833333333333 | 0 |
| 0.8527777777777777 | 0 |
| 0.8534722222222223 | 0 |
| 0.8541666666666666 | 0 |
| 0.8548611111111111 | 0 |
| 0.8555555555555556 | 0 |
| 0.8562500000000001 | 0 |
| 0.8569444444444444 | 0 |
| 0.8576388888888888 | 0 |
| 0.8583333333333334 | 0 |
| 0.8590277777777778 | 0 |
| 0.8597222222222222 | 0 |
| 0.8604166666666666 | 0 |
| 0.8611111111111112 | 0 |
| 0.8618055555555556 | 0 |
| 0.8624999999999999 | 0 |
| 0.8631944444444444 | 0 |
| 0.8638888888888889 | 0 |
| 0.8645833333333334 | 0 |
| 0.8652777777777777 | 0 |
| 0.8659722222222223 | 0 |
| 0.8666666666666667 | 0 |
| 0.8673611111111111 | 0 |
| 0.8680555555555555 | 0 |
| 0.86875 | 0 |
| 0.8694444444444445 | 0 |
| 0.8701388888888889 | 0 |
| 0.8708333333333332 | 0 |
| 0.8715277777777778 | 0 |
| 0.8722222222222222 | 0 |
| 0.8729166666666667 | 0 |
| 0.873611111111111 | 0 |
| 0.8743055555555556 | 0 |
| 0.875 | 0 |
| 0.8756944444444444 | 0 |
| 0.876388888888889 | 0 |
| 0.8770833333333333 | 0 |
| 0.8777777777777778 | 0 |
| 0.8784722222222222 | 0 |
| 0.8791666666666668 | 0 |
| 0.8798611111111111 | 0 |
| 0.8805555555555555 | 0 |
| 0.88125 | 0 |
| 0.8819444444444445 | 0 |
| 0.8826388888888889 | 0 |
| 0.8833333333333333 | 0 |
| 0.8840277777777777 | 0 |
| 0.8847222222222223 | 0 |
| 0.8854166666666666 | 0 |
| 0.8861111111111111 | 0 |
| 0.8868055555555556 | 0 |
| 0.8875000000000001 | 0 |
| 0.8881944444444444 | 0 |
| 0.8888888888888888 | 0 |
| 0.8895833333333334 | 0 |
| 0.8902777777777778 | 0 |
| 0.8909722222222222 | 0 |
| 0.8916666666666666 | 0 |
| 0.8923611111111112 | 0 |
| 0.8930555555555556 | 0 |
| 0.8937499999999999 | 0 |
| 0.8944444444444444 | 0 |
| 0.8951388888888889 | 0 |
| 0.8958333333333334 | 0 |
| 0.8965277777777777 | 0 |
| 0.8972222222222223 | 0 |
| 0.8979166666666667 | 0 |
| 0.8986111111111111 | 0 |
| 0.8993055555555555 | 0 |
| 0.9 | 0 |
| 0.9006944444444445 | 0 |
| 0.9013888888888889 | 0 |
| 0.9020833333333332 | 0 |
| 0.9027777777777778 | 0 |
| 0.9034722222222222 | 0 |
| 0.9041666666666667 | 0 |
| 0.904861111111111 | 0 |
| 0.9055555555555556 | 0 |
| 0.90625 | 0 |
| 0.9069444444444444 | 0 |
| 0.907638888888889 | 0 |
| 0.9083333333333333 | 0 |
| 0.9090277777777778 | 0 |
| 0.9097222222222222 | 0 |
| 0.9104166666666668 | 0 |
| 0.9111111111111111 | 0 |
| 0.9118055555555555 | 0 |
| 0.9125 | 0 |
| 0.9131944444444445 | 0 |
| 0.9138888888888889 | 0 |
| 0.9145833333333333 | 0 |
| 0.9152777777777777 | 0 |
| 0.9159722222222223 | 0 |
| 0.9166666666666666 | 0 |
| 0.9173611111111111 | 0 |
| 0.9180555555555556 | 0 |
| 0.9187500000000001 | 0 |
| 0.9194444444444444 | 0 |
| 0.9201388888888888 | 0 |
| 0.9208333333333334 | 0 |
| 0.9215277777777778 | 0 |
| 0.9222222222222222 | 0 |
| 0.9229166666666666 | 0 |
| 0.9236111111111112 | 0 |
| 0.9243055555555556 | 0 |
| 0.9249999999999999 | 0 |
| 0.9256944444444444 | 0 |
| 0.9263888888888889 | 0 |
| 0.9270833333333334 | 0 |
| 0.9277777777777777 | 0 |
| 0.9284722222222223 | 0 |
| 0.9291666666666667 | 0 |
| 0.9298611111111111 | 0 |
| 0.9305555555555555 | 0 |
| 0.93125 | 0 |
| 0.9319444444444445 | 0 |
| 0.9326388888888889 | 0 |
| 0.9333333333333332 | 0 |
| 0.9340277777777778 | 0 |
| 0.9347222222222222 | 0 |
| 0.9354166666666667 | 0 |
| 0.936111111111111 | 0 |
| 0.9368055555555556 | 0 |
| 0.9375 | 0 |
| 0.9381944444444444 | 0 |
| 0.938888888888889 | 0 |
| 0.9395833333333333 | 0 |
| 0.9402777777777778 | 0 |
| 0.9409722222222222 | 0 |
| 0.9416666666666668 | 0 |
| 0.9423611111111111 | 0 |
| 0.9430555555555555 | 0 |
| 0.94375 | 0 |
| 0.9444444444444445 | 0 |
| 0.9451388888888889 | 0 |
| 0.9458333333333333 | 0 |
| 0.9465277777777777 | 0 |
| 0.9472222222222223 | 0 |
| 0.9479166666666666 | 0 |
| 0.9486111111111111 | 0 |
| 0.9493055555555556 | 0 |
| 0.9500000000000001 | 0 |
| 0.9506944444444444 | 0 |
| 0.9513888888888888 | 0 |
| 0.9520833333333334 | 0 |
| 0.9527777777777778 | 0 |
| 0.9534722222222222 | 0 |
| 0.9541666666666666 | 0 |
| 0.9548611111111112 | 0 |
| 0.9555555555555556 | 0 |
| 0.9562499999999999 | 0 |
| 0.9569444444444444 | 0 |
| 0.9576388888888889 | 0 |
| 0.9583333333333334 | 0 |
| 0.9590277777777777 | 0 |
| 0.9597222222222223 | 0 |
| 0.9604166666666667 | 0 |
| 0.9611111111111111 | 0 |
| 0.9618055555555555 | 0 |
| 0.9625 | 0 |
| 0.9631944444444445 | 0 |
| 0.9638888888888889 | 0 |
| 0.9645833333333332 | 0 |
| 0.9652777777777778 | 0 |
| 0.9659722222222222 | 0 |
| 0.9666666666666667 | 0 |
| 0.967361111111111 | 0 |
| 0.9680555555555556 | 0 |
| 0.96875 | 0 |
| 0.9694444444444444 | 0 |
| 0.970138888888889 | 0 |
| 0.9708333333333333 | 0 |
| 0.9715277777777778 | 0 |
| 0.9722222222222222 | 0 |
| 0.9729166666666668 | 0 |
| 0.9736111111111111 | 0 |
| 0.9743055555555555 | 0 |
| 0.975 | 0 |
| 0.9756944444444445 | 0 |
| 0.9763888888888889 | 0 |
| 0.9770833333333333 | 0 |
| 0.9777777777777777 | 0 |
| 0.9784722222222223 | 0 |
| 0.9791666666666666 | 0 |
| 0.9798611111111111 | 0 |
| 0.9805555555555556 | 0 |
| 0.9812500000000001 | 0 |
| 0.9819444444444444 | 0 |
| 0.9826388888888888 | 0 |
| 0.9833333333333334 | 0 |
| 0.9840277777777778 | 0 |
| 0.9847222222222222 | 0 |
| 0.9854166666666666 | 0 |
| 0.9861111111111112 | 0 |
| 0.9868055555555556 | 0 |
| 0.9874999999999999 | 0 |
| 0.9881944444444444 | 0 |
| 0.9888888888888889 | 0 |
| 0.9895833333333334 | 0 |
| 0.9902777777777777 | 0 |
| 0.9909722222222223 | 0 |
| 0.9916666666666667 | 0 |
| 0.9923611111111111 | 0 |
| 0.9930555555555555 | 0 |
| 0.99375 | 0 |
| 0.9944444444444445 | 0 |
| 0.9951388888888889 | 0 |
| 0.9958333333333332 | 0 |
| 0.9965277777777778 | 0 |
| 0.9972222222222222 | 0 |
| 0.9979166666666667 | 0 |
| 0.998611111111111 | 0 |
| 0.9993055555555556 | 0 |